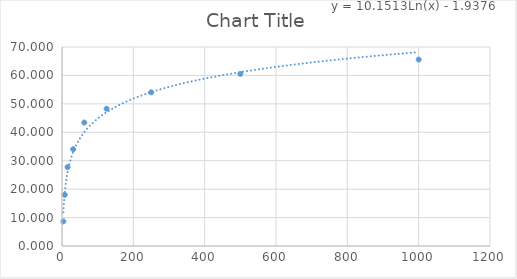
| Category | Series 0 |
|---|---|
| 3.91 | 8.649 |
| 7.81 | 18.018 |
| 15.62 | 27.748 |
| 31.25 | 34.054 |
| 62.5 | 43.423 |
| 125.0 | 48.288 |
| 250.0 | 54.054 |
| 500.0 | 60.541 |
| 1000.0 | 65.586 |